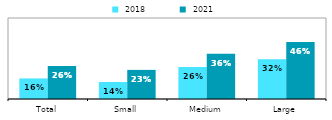
| Category |  2018 |  2021 |
|---|---|---|
| Total | 0.165 | 0.264 |
| Small | 0.136 | 0.234 |
| Medium | 0.258 | 0.362 |
| Large | 0.319 | 0.457 |